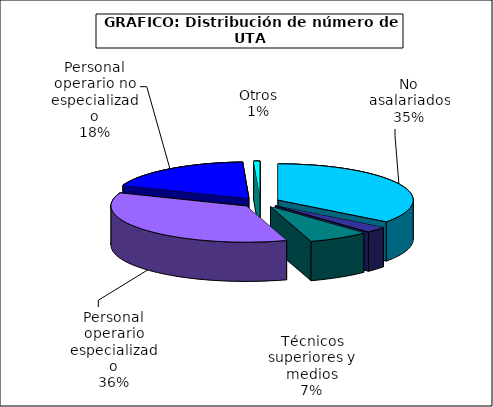
| Category | Series 0 |
|---|---|
| No asalariados | 1991.731 |
| Administrativos | 150.254 |
| Técnicos superiores y medios | 411.319 |
| Personal operario especializado | 2020.108 |
| Personal operario no especializado | 1040.273 |
| Otros | 41.952 |